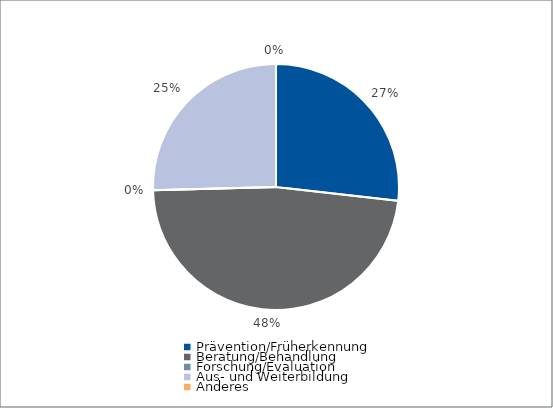
| Category | Series 0 |
|---|---|
| Prävention/Früherkennung | 1845 |
| Beratung/Behandlung | 3290 |
| Forschung/Evaluation | 0 |
| Aus- und Weiterbildung | -1750 |
| Anderes | 0 |